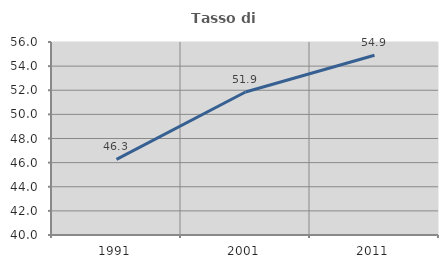
| Category | Tasso di occupazione   |
|---|---|
| 1991.0 | 46.265 |
| 2001.0 | 51.852 |
| 2011.0 | 54.902 |